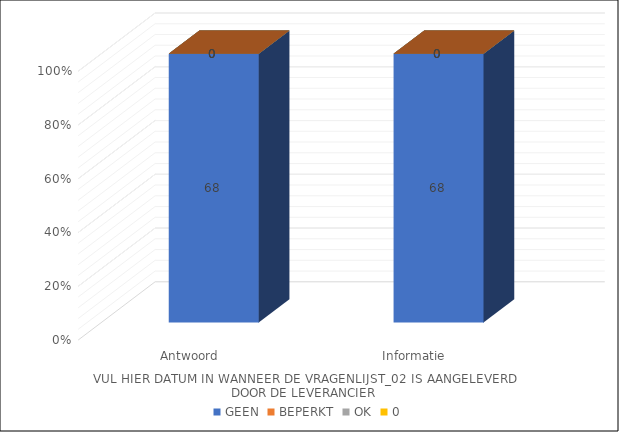
| Category | GEEN | BEPERKT | OK | 0 |
|---|---|---|---|---|
| 0 | 68 | 0 | 0 | 0 |
| 1 | 68 | 0 | 0 | 0 |